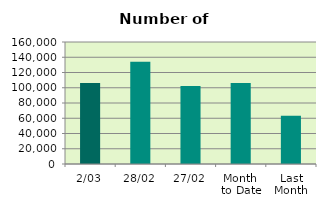
| Category | Series 0 |
|---|---|
| 2/03 | 106084 |
| 28/02 | 134030 |
| 27/02 | 102420 |
| Month 
to Date | 106084 |
| Last
Month | 63353.4 |